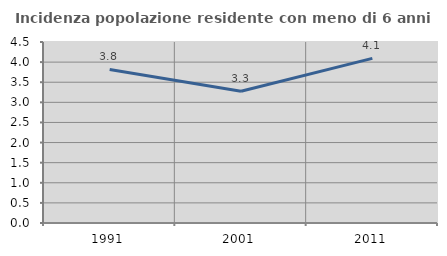
| Category | Incidenza popolazione residente con meno di 6 anni |
|---|---|
| 1991.0 | 3.817 |
| 2001.0 | 3.274 |
| 2011.0 | 4.093 |